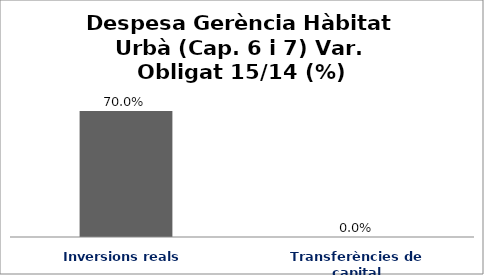
| Category | Series 0 |
|---|---|
| Inversions reals | 0.7 |
| Transferències de capital | 0 |